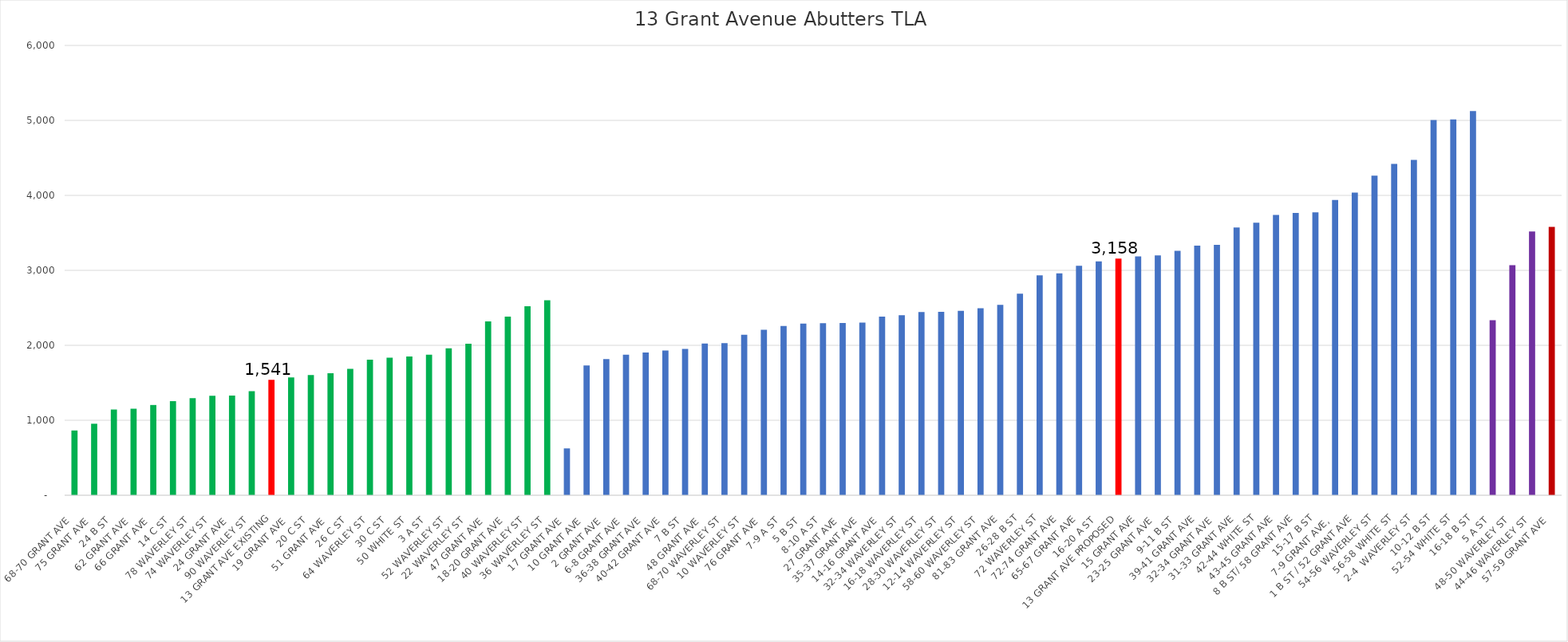
| Category | TLA |
|---|---|
| 68-70 GRANT AVE  | 864 |
| 75 GRANT AVE  | 954 |
| 24 B ST  | 1144 |
| 62 GRANT AVE  | 1155 |
| 66 GRANT AVE  | 1204 |
| 14 C ST  | 1254 |
| 78 WAVERLEY ST  | 1294 |
| 74 WAVERLEY ST  | 1328 |
| 24 GRANT AVE  | 1329 |
| 90 WAVERLEY ST  | 1387 |
| 13 GRANT AVE EXISTING | 1541 |
| 19 GRANT AVE  | 1572 |
| 20 C ST  | 1604 |
| 51 GRANT AVE  | 1627 |
| 26 C ST  | 1685 |
| 64 WAVERLEY ST  | 1808 |
| 30 C ST  | 1834 |
| 50 WHITE ST  | 1852 |
| 3 A ST  | 1874 |
| 52 WAVERLEY ST  | 1960 |
| 22 WAVERLEY ST  | 2020 |
| 47 GRANT AVE  | 2320 |
| 18-20 GRANT AVE  | 2384 |
| 40 WAVERLEY ST  | 2522 |
| 36 WAVERLEY ST  | 2602 |
| 17 GRANT AVE  | 625 |
| 10 GRANT AVE  | 1732 |
| 2 GRANT AVE  | 1817 |
| 6-8 GRANT AVE  | 1876 |
| 36-38 GRANT AVE  | 1904 |
| 40-42 GRANT AVE  | 1932 |
| 7 B ST  | 1952 |
| 48 GRANT AVE  | 2023 |
| 68-70 WAVERLEY ST  | 2028 |
| 10 WAVERLEY ST  | 2140 |
| 76 GRANT AVE  | 2208 |
| 7-9 A ST  | 2258 |
| 5 B ST  | 2290 |
| 8-10 A ST  | 2296 |
| 27 GRANT AVE  | 2297 |
| 35-37 GRANT AVE  | 2302 |
| 14-16 GRANT AVE  | 2384 |
| 32-34 WAVERLEY ST  | 2402 |
| 16-18 WAVERLEY ST  | 2444 |
| 28-30 WAVERLEY ST  | 2448 |
| 12-14 WAVERLEY ST  | 2460 |
| 58-60 WAVERLEY ST  | 2496 |
| 81-83 GRANT AVE | 2540 |
| 26-28 B ST | 2688 |
| 72 WAVERLEY ST | 2934 |
| 72-74 GRANT AVE | 2960 |
| 65-67 GRANT AVE | 3060 |
| 16-20 A ST  | 3121 |
| 13 GRANT AVE PROPOSED | 3158 |
| 15 GRANT AVE | 3186 |
| 23-25 GRANT AVE  | 3200 |
| 9-11 B ST  | 3261 |
| 39-41 GRANT AVE | 3331 |
| 32-34 GRANT AVE  | 3340 |
| 31-33 GRANT AVE | 3572 |
| 42-44 WHITE ST | 3636 |
| 43-45 GRANT AVE | 3740 |
| 8 B ST/ 58 GRANT AVE | 3766 |
| 15-17 B ST | 3774 |
| 7-9 GRANT AVE,  | 3938 |
| 1 B ST / 52 GRANT AVE | 4038 |
| 54-56 WAVERLEY ST | 4262 |
| 56-58 WHITE ST | 4420 |
| 2-4  WAVERLEY ST | 4474 |
| 10-12 B ST | 5006 |
| 52-54 WHITE ST | 5014 |
| 16-18 B ST | 5124 |
| 5 A ST  | 2336 |
| 48-50 WAVERLEY ST  | 3068 |
| 44-46 WAVERLEY ST  | 3519 |
| 57-59 GRANT AVE  | 3579 |